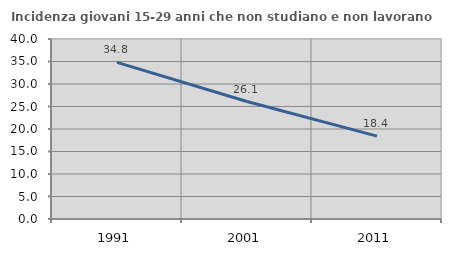
| Category | Incidenza giovani 15-29 anni che non studiano e non lavorano  |
|---|---|
| 1991.0 | 34.802 |
| 2001.0 | 26.107 |
| 2011.0 | 18.421 |